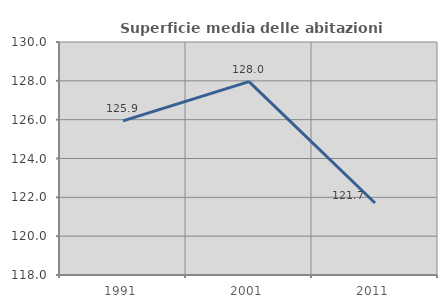
| Category | Superficie media delle abitazioni occupate |
|---|---|
| 1991.0 | 125.935 |
| 2001.0 | 127.961 |
| 2011.0 | 121.708 |